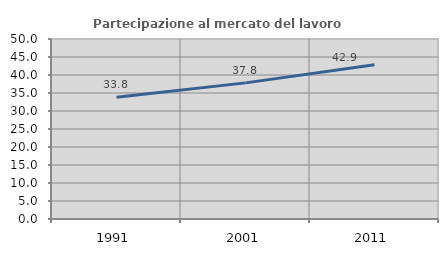
| Category | Partecipazione al mercato del lavoro  femminile |
|---|---|
| 1991.0 | 33.803 |
| 2001.0 | 37.811 |
| 2011.0 | 42.877 |